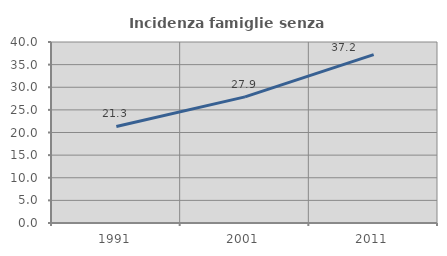
| Category | Incidenza famiglie senza nuclei |
|---|---|
| 1991.0 | 21.338 |
| 2001.0 | 27.867 |
| 2011.0 | 37.216 |